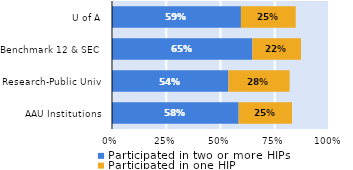
| Category | Participated in two or more HIPs | Participated in one HIP |
|---|---|---|
| AAU Institutions | 0.584 | 0.246 |
| Research-Public Univ | 0.536 | 0.282 |
| Benchmark 12 & SEC | 0.647 | 0.224 |
| U of A | 0.594 | 0.253 |